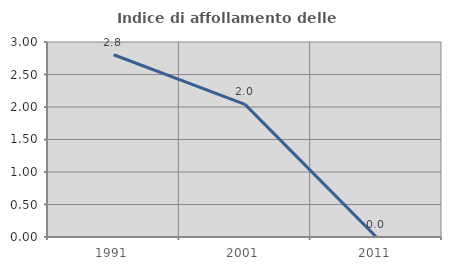
| Category | Indice di affollamento delle abitazioni  |
|---|---|
| 1991.0 | 2.804 |
| 2001.0 | 2.041 |
| 2011.0 | 0 |